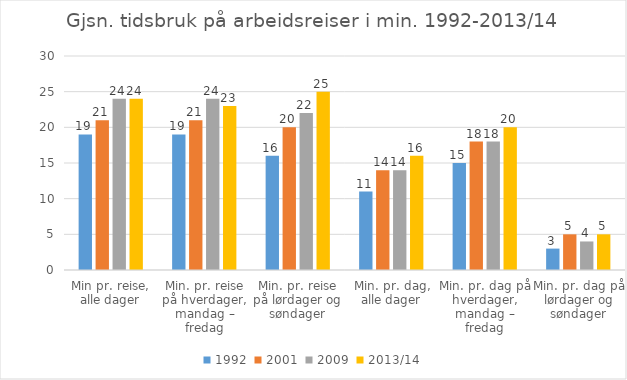
| Category | 1992 | 2001 | 2009 | 2013/14 |
|---|---|---|---|---|
| Min pr. reise, alle dager | 19 | 21 | 24 | 24 |
| Min. pr. reise på hverdager, mandag – fredag | 19 | 21 | 24 | 23 |
| Min. pr. reise på lørdager og søndager | 16 | 20 | 22 | 25 |
| Min. pr. dag, alle dager | 11 | 14 | 14 | 16 |
| Min. pr. dag på hverdager, mandag – fredag | 15 | 18 | 18 | 20 |
| Min. pr. dag på lørdager og søndager | 3 | 5 | 4 | 5 |